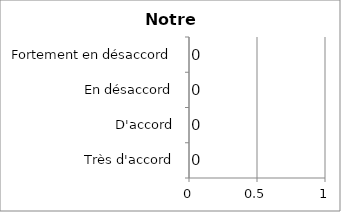
| Category | D |
|---|---|
| Très d'accord | 0 |
| D'accord | 0 |
| En désaccord | 0 |
| Fortement en désaccord | 0 |